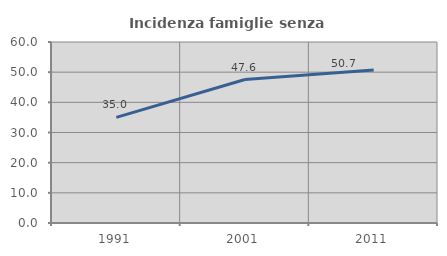
| Category | Incidenza famiglie senza nuclei |
|---|---|
| 1991.0 | 35.003 |
| 2001.0 | 47.562 |
| 2011.0 | 50.689 |